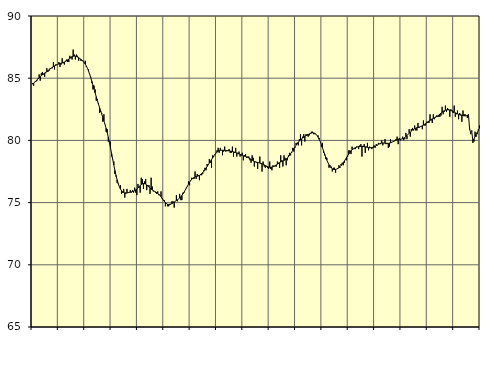
| Category | Piggar | Series 1 |
|---|---|---|
| nan | 84.6 | 84.53 |
| 87.0 | 84.4 | 84.6 |
| 87.0 | 84.7 | 84.68 |
| 87.0 | 84.7 | 84.77 |
| 87.0 | 84.8 | 84.86 |
| 87.0 | 85 | 84.95 |
| 87.0 | 85.3 | 85.04 |
| 87.0 | 84.8 | 85.13 |
| 87.0 | 85.4 | 85.21 |
| 87.0 | 85.5 | 85.28 |
| 87.0 | 85.3 | 85.35 |
| 87.0 | 85.1 | 85.41 |
| nan | 85.4 | 85.48 |
| 88.0 | 85.8 | 85.54 |
| 88.0 | 85.5 | 85.6 |
| 88.0 | 85.6 | 85.67 |
| 88.0 | 85.8 | 85.74 |
| 88.0 | 85.8 | 85.81 |
| 88.0 | 85.8 | 85.88 |
| 88.0 | 86.3 | 85.93 |
| 88.0 | 85.7 | 85.99 |
| 88.0 | 86.1 | 86.03 |
| 88.0 | 86.1 | 86.07 |
| 88.0 | 86.1 | 86.11 |
| nan | 86.3 | 86.15 |
| 89.0 | 85.9 | 86.18 |
| 89.0 | 86.1 | 86.21 |
| 89.0 | 86.6 | 86.23 |
| 89.0 | 86.2 | 86.27 |
| 89.0 | 86.1 | 86.3 |
| 89.0 | 86.4 | 86.35 |
| 89.0 | 86.5 | 86.4 |
| 89.0 | 86.3 | 86.47 |
| 89.0 | 86.3 | 86.54 |
| 89.0 | 86.8 | 86.61 |
| 89.0 | 86.6 | 86.68 |
| nan | 86.5 | 86.73 |
| 90.0 | 87.3 | 86.77 |
| 90.0 | 86.9 | 86.78 |
| 90.0 | 86.5 | 86.78 |
| 90.0 | 86.9 | 86.75 |
| 90.0 | 86.8 | 86.7 |
| 90.0 | 86.4 | 86.65 |
| 90.0 | 86.6 | 86.58 |
| 90.0 | 86.4 | 86.52 |
| 90.0 | 86.4 | 86.45 |
| 90.0 | 86.4 | 86.36 |
| 90.0 | 86.3 | 86.26 |
| nan | 86.4 | 86.13 |
| 91.0 | 85.9 | 85.98 |
| 91.0 | 85.8 | 85.79 |
| 91.0 | 85.7 | 85.57 |
| 91.0 | 85.3 | 85.32 |
| 91.0 | 85.1 | 85.05 |
| 91.0 | 84.6 | 84.75 |
| 91.0 | 84.1 | 84.45 |
| 91.0 | 84.4 | 84.13 |
| 91.0 | 84.1 | 83.82 |
| 91.0 | 83.2 | 83.51 |
| 91.0 | 83.3 | 83.21 |
| nan | 83 | 82.93 |
| 92.0 | 82.2 | 82.65 |
| 92.0 | 82.3 | 82.38 |
| 92.0 | 82.2 | 82.11 |
| 92.0 | 81.5 | 81.85 |
| 92.0 | 82.1 | 81.57 |
| 92.0 | 81.3 | 81.28 |
| 92.0 | 80.7 | 80.97 |
| 92.0 | 80.9 | 80.63 |
| 92.0 | 79.9 | 80.25 |
| 92.0 | 79.9 | 79.84 |
| 92.0 | 79.9 | 79.4 |
| nan | 78.7 | 78.94 |
| 93.0 | 78.5 | 78.47 |
| 93.0 | 78.3 | 78.02 |
| 93.0 | 77.3 | 77.59 |
| 93.0 | 77.1 | 77.19 |
| 93.0 | 76.6 | 76.84 |
| 93.0 | 76.5 | 76.54 |
| 93.0 | 76.3 | 76.29 |
| 93.0 | 76.4 | 76.1 |
| 93.0 | 75.7 | 75.96 |
| 93.0 | 75.8 | 75.87 |
| 93.0 | 76.1 | 75.81 |
| nan | 75.4 | 75.78 |
| 94.0 | 75.7 | 75.78 |
| 94.0 | 76.1 | 75.78 |
| 94.0 | 75.8 | 75.8 |
| 94.0 | 75.8 | 75.82 |
| 94.0 | 76 | 75.84 |
| 94.0 | 75.8 | 75.86 |
| 94.0 | 76 | 75.89 |
| 94.0 | 75.8 | 75.92 |
| 94.0 | 76.2 | 75.96 |
| 94.0 | 75.8 | 76.02 |
| 94.0 | 75.6 | 76.09 |
| nan | 76.5 | 76.18 |
| 95.0 | 76.2 | 76.28 |
| 95.0 | 75.8 | 76.37 |
| 95.0 | 77 | 76.45 |
| 95.0 | 76.9 | 76.5 |
| 95.0 | 76.1 | 76.53 |
| 95.0 | 76.7 | 76.52 |
| 95.0 | 76.9 | 76.49 |
| 95.0 | 76 | 76.42 |
| 95.0 | 76.4 | 76.34 |
| 95.0 | 76.4 | 76.25 |
| 95.0 | 75.7 | 76.16 |
| nan | 77 | 76.08 |
| 96.0 | 76.3 | 76.01 |
| 96.0 | 75.9 | 75.95 |
| 96.0 | 75.9 | 75.91 |
| 96.0 | 75.8 | 75.86 |
| 96.0 | 75.7 | 75.81 |
| 96.0 | 75.9 | 75.75 |
| 96.0 | 75.6 | 75.68 |
| 96.0 | 75.6 | 75.58 |
| 96.0 | 75.9 | 75.47 |
| 96.0 | 75.3 | 75.34 |
| 96.0 | 75.2 | 75.22 |
| nan | 75.2 | 75.11 |
| 97.0 | 74.7 | 75 |
| 97.0 | 74.9 | 74.92 |
| 97.0 | 74.7 | 74.86 |
| 97.0 | 74.7 | 74.84 |
| 97.0 | 74.9 | 74.85 |
| 97.0 | 74.9 | 74.88 |
| 97.0 | 75.1 | 74.93 |
| 97.0 | 75.1 | 74.99 |
| 97.0 | 74.6 | 75.05 |
| 97.0 | 75.1 | 75.11 |
| 97.0 | 75.6 | 75.17 |
| nan | 75.1 | 75.23 |
| 98.0 | 75.3 | 75.29 |
| 98.0 | 75.7 | 75.37 |
| 98.0 | 75.2 | 75.46 |
| 98.0 | 75.2 | 75.57 |
| 98.0 | 75.8 | 75.7 |
| 98.0 | 75.8 | 75.84 |
| 98.0 | 76 | 76 |
| 98.0 | 76.2 | 76.16 |
| 98.0 | 76.3 | 76.32 |
| 98.0 | 76.7 | 76.48 |
| 98.0 | 76.4 | 76.63 |
| nan | 76.8 | 76.77 |
| 99.0 | 77 | 76.88 |
| 99.0 | 76.9 | 76.96 |
| 99.0 | 76.9 | 77.02 |
| 99.0 | 77.5 | 77.07 |
| 99.0 | 76.9 | 77.1 |
| 99.0 | 77.3 | 77.12 |
| 99.0 | 77.2 | 77.15 |
| 99.0 | 76.8 | 77.18 |
| 99.0 | 77.3 | 77.24 |
| 99.0 | 77.2 | 77.32 |
| 99.0 | 77.3 | 77.41 |
| nan | 77.6 | 77.52 |
| 0.0 | 77.8 | 77.64 |
| 0.0 | 77.6 | 77.77 |
| 0.0 | 78.1 | 77.91 |
| 0.0 | 78.1 | 78.05 |
| 0.0 | 78.5 | 78.18 |
| 0.0 | 78.2 | 78.32 |
| 0.0 | 77.8 | 78.47 |
| 0.0 | 78.8 | 78.6 |
| 0.0 | 78.7 | 78.74 |
| 0.0 | 78.9 | 78.86 |
| 0.0 | 79 | 78.97 |
| nan | 79.2 | 79.06 |
| 1.0 | 79.4 | 79.13 |
| 1.0 | 79 | 79.17 |
| 1.0 | 79.4 | 79.2 |
| 1.0 | 79.2 | 79.21 |
| 1.0 | 78.8 | 79.21 |
| 1.0 | 79.1 | 79.2 |
| 1.0 | 79.5 | 79.19 |
| 1.0 | 79.1 | 79.18 |
| 1.0 | 79.2 | 79.17 |
| 1.0 | 79.2 | 79.17 |
| 1.0 | 79.3 | 79.16 |
| nan | 79 | 79.14 |
| 2.0 | 79 | 79.13 |
| 2.0 | 79.5 | 79.1 |
| 2.0 | 78.7 | 79.08 |
| 2.0 | 79 | 79.05 |
| 2.0 | 79.4 | 79.02 |
| 2.0 | 78.7 | 78.99 |
| 2.0 | 79 | 78.95 |
| 2.0 | 79.1 | 78.91 |
| 2.0 | 78.7 | 78.88 |
| 2.0 | 78.8 | 78.84 |
| 2.0 | 79 | 78.8 |
| nan | 78.4 | 78.76 |
| 3.0 | 78.8 | 78.73 |
| 3.0 | 78.9 | 78.7 |
| 3.0 | 78.6 | 78.67 |
| 3.0 | 78.7 | 78.63 |
| 3.0 | 78.7 | 78.58 |
| 3.0 | 78.4 | 78.53 |
| 3.0 | 78.2 | 78.47 |
| 3.0 | 78.8 | 78.41 |
| 3.0 | 78.6 | 78.35 |
| 3.0 | 77.9 | 78.31 |
| 3.0 | 78.3 | 78.27 |
| nan | 78.2 | 78.25 |
| 4.0 | 77.7 | 78.23 |
| 4.0 | 78.2 | 78.2 |
| 4.0 | 78.7 | 78.18 |
| 4.0 | 78.1 | 78.15 |
| 4.0 | 77.5 | 78.12 |
| 4.0 | 78.3 | 78.08 |
| 4.0 | 77.9 | 78.03 |
| 4.0 | 77.8 | 77.98 |
| 4.0 | 77.9 | 77.94 |
| 4.0 | 77.8 | 77.89 |
| 4.0 | 77.7 | 77.86 |
| nan | 78.3 | 77.84 |
| 5.0 | 77.7 | 77.84 |
| 5.0 | 77.6 | 77.86 |
| 5.0 | 78 | 77.88 |
| 5.0 | 77.9 | 77.92 |
| 5.0 | 77.9 | 77.98 |
| 5.0 | 77.9 | 78.03 |
| 5.0 | 78.3 | 78.09 |
| 5.0 | 78.2 | 78.15 |
| 5.0 | 77.8 | 78.21 |
| 5.0 | 78.8 | 78.26 |
| 5.0 | 78.4 | 78.3 |
| nan | 77.9 | 78.35 |
| 6.0 | 78.8 | 78.39 |
| 6.0 | 78.6 | 78.44 |
| 6.0 | 78 | 78.5 |
| 6.0 | 78.4 | 78.58 |
| 6.0 | 78.8 | 78.68 |
| 6.0 | 79 | 78.79 |
| 6.0 | 78.8 | 78.92 |
| 6.0 | 79 | 79.06 |
| 6.0 | 79.4 | 79.2 |
| 6.0 | 79.1 | 79.35 |
| 6.0 | 79.4 | 79.48 |
| nan | 79.8 | 79.62 |
| 7.0 | 79.8 | 79.74 |
| 7.0 | 79.6 | 79.85 |
| 7.0 | 80.1 | 79.95 |
| 7.0 | 80.5 | 80.04 |
| 7.0 | 79.6 | 80.12 |
| 7.0 | 80.3 | 80.19 |
| 7.0 | 80.5 | 80.25 |
| 7.0 | 79.9 | 80.31 |
| 7.0 | 80.5 | 80.37 |
| 7.0 | 80.5 | 80.42 |
| 7.0 | 80.3 | 80.47 |
| nan | 80.4 | 80.52 |
| 8.0 | 80.6 | 80.56 |
| 8.0 | 80.7 | 80.59 |
| 8.0 | 80.7 | 80.61 |
| 8.0 | 80.5 | 80.6 |
| 8.0 | 80.5 | 80.57 |
| 8.0 | 80.5 | 80.51 |
| 8.0 | 80.4 | 80.41 |
| 8.0 | 80.4 | 80.27 |
| 8.0 | 80.2 | 80.1 |
| 8.0 | 79.9 | 79.9 |
| 8.0 | 79.5 | 79.67 |
| nan | 79.8 | 79.42 |
| 9.0 | 79 | 79.16 |
| 9.0 | 78.8 | 78.9 |
| 9.0 | 78.5 | 78.65 |
| 9.0 | 78.6 | 78.42 |
| 9.0 | 78.2 | 78.21 |
| 9.0 | 77.8 | 78.04 |
| 9.0 | 78 | 77.9 |
| 9.0 | 77.9 | 77.79 |
| 9.0 | 77.5 | 77.71 |
| 9.0 | 77.8 | 77.67 |
| 9.0 | 77.8 | 77.66 |
| nan | 77.4 | 77.67 |
| 10.0 | 77.7 | 77.7 |
| 10.0 | 77.7 | 77.75 |
| 10.0 | 78 | 77.81 |
| 10.0 | 77.8 | 77.89 |
| 10.0 | 78.1 | 77.98 |
| 10.0 | 78.2 | 78.09 |
| 10.0 | 78 | 78.21 |
| 10.0 | 78.2 | 78.34 |
| 10.0 | 78.5 | 78.48 |
| 10.0 | 78.4 | 78.63 |
| 10.0 | 78.7 | 78.77 |
| nan | 79.2 | 78.91 |
| 11.0 | 79.2 | 79.03 |
| 11.0 | 78.9 | 79.15 |
| 11.0 | 79.5 | 79.24 |
| 11.0 | 79.3 | 79.31 |
| 11.0 | 79.3 | 79.37 |
| 11.0 | 79.3 | 79.42 |
| 11.0 | 79.5 | 79.45 |
| 11.0 | 79.5 | 79.48 |
| 11.0 | 79.3 | 79.5 |
| 11.0 | 79.6 | 79.51 |
| 11.0 | 79.7 | 79.52 |
| nan | 78.7 | 79.52 |
| 12.0 | 79.5 | 79.52 |
| 12.0 | 79.7 | 79.5 |
| 12.0 | 79 | 79.48 |
| 12.0 | 79.5 | 79.46 |
| 12.0 | 79.8 | 79.44 |
| 12.0 | 79.2 | 79.42 |
| 12.0 | 79.5 | 79.41 |
| 12.0 | 79.4 | 79.41 |
| 12.0 | 79.3 | 79.43 |
| 12.0 | 79.4 | 79.45 |
| 12.0 | 79.6 | 79.49 |
| nan | 79.4 | 79.53 |
| 13.0 | 79.7 | 79.58 |
| 13.0 | 79.6 | 79.63 |
| 13.0 | 79.8 | 79.69 |
| 13.0 | 79.7 | 79.73 |
| 13.0 | 79.7 | 79.77 |
| 13.0 | 80 | 79.79 |
| 13.0 | 79.6 | 79.79 |
| 13.0 | 79.8 | 79.79 |
| 13.0 | 80.1 | 79.78 |
| 13.0 | 79.7 | 79.76 |
| 13.0 | 79.8 | 79.76 |
| nan | 79.4 | 79.76 |
| 14.0 | 79.5 | 79.78 |
| 14.0 | 80.1 | 79.81 |
| 14.0 | 79.8 | 79.85 |
| 14.0 | 79.9 | 79.89 |
| 14.0 | 79.9 | 79.94 |
| 14.0 | 80 | 79.99 |
| 14.0 | 80.1 | 80.02 |
| 14.0 | 80.3 | 80.05 |
| 14.0 | 79.7 | 80.07 |
| 14.0 | 80.2 | 80.08 |
| 14.0 | 80 | 80.09 |
| nan | 80.1 | 80.11 |
| 15.0 | 80.3 | 80.14 |
| 15.0 | 80 | 80.18 |
| 15.0 | 80.1 | 80.24 |
| 15.0 | 80.6 | 80.32 |
| 15.0 | 80.1 | 80.4 |
| 15.0 | 80.5 | 80.49 |
| 15.0 | 80.9 | 80.58 |
| 15.0 | 80.3 | 80.67 |
| 15.0 | 80.9 | 80.75 |
| 15.0 | 81 | 80.83 |
| 15.0 | 80.8 | 80.89 |
| nan | 81.2 | 80.94 |
| 16.0 | 80.8 | 80.98 |
| 16.0 | 80.8 | 81.02 |
| 16.0 | 81.4 | 81.04 |
| 16.0 | 81 | 81.07 |
| 16.0 | 81.1 | 81.1 |
| 16.0 | 81.1 | 81.13 |
| 16.0 | 80.9 | 81.18 |
| 16.0 | 81.6 | 81.23 |
| 16.0 | 81.2 | 81.29 |
| 16.0 | 81.2 | 81.35 |
| 16.0 | 81.5 | 81.42 |
| nan | 81.4 | 81.49 |
| 17.0 | 81.4 | 81.56 |
| 17.0 | 82.1 | 81.62 |
| 17.0 | 81.6 | 81.68 |
| 17.0 | 81.4 | 81.73 |
| 17.0 | 82.1 | 81.77 |
| 17.0 | 81.7 | 81.82 |
| 17.0 | 81.9 | 81.86 |
| 17.0 | 82 | 81.91 |
| 17.0 | 81.9 | 81.97 |
| 17.0 | 81.9 | 82.04 |
| 17.0 | 81.9 | 82.12 |
| nan | 82 | 82.2 |
| 18.0 | 82.7 | 82.27 |
| 18.0 | 82.1 | 82.34 |
| 18.0 | 82.3 | 82.39 |
| 18.0 | 82.8 | 82.43 |
| 18.0 | 82.3 | 82.45 |
| 18.0 | 82.6 | 82.46 |
| 18.0 | 82.5 | 82.45 |
| 18.0 | 81.9 | 82.43 |
| 18.0 | 82.5 | 82.4 |
| 18.0 | 82.4 | 82.36 |
| 18.0 | 82.2 | 82.32 |
| nan | 82.8 | 82.27 |
| 19.0 | 81.9 | 82.22 |
| 19.0 | 82.1 | 82.18 |
| 19.0 | 82.4 | 82.13 |
| 19.0 | 81.7 | 82.09 |
| 19.0 | 82.2 | 82.06 |
| 19.0 | 82.1 | 82.03 |
| 19.0 | 81.5 | 82 |
| 19.0 | 82.4 | 81.99 |
| 19.0 | 82.1 | 81.98 |
| 19.0 | 82.1 | 81.97 |
| 19.0 | 82 | 81.98 |
| nan | 81.8 | 82.01 |
| 20.0 | 82.1 | 82.04 |
| 20.0 | 80.9 | 80.96 |
| 20.0 | 80.5 | 80.6 |
| 20.0 | 80.8 | 80.71 |
| 20.0 | 79.8 | 79.97 |
| 20.0 | 79.9 | 80.12 |
| 20.0 | 80.7 | 80.29 |
| 20.0 | 80.3 | 80.47 |
| 20.0 | 80.5 | 80.64 |
| 20.0 | 80.9 | 80.81 |
| 20.0 | 81.2 | 80.96 |